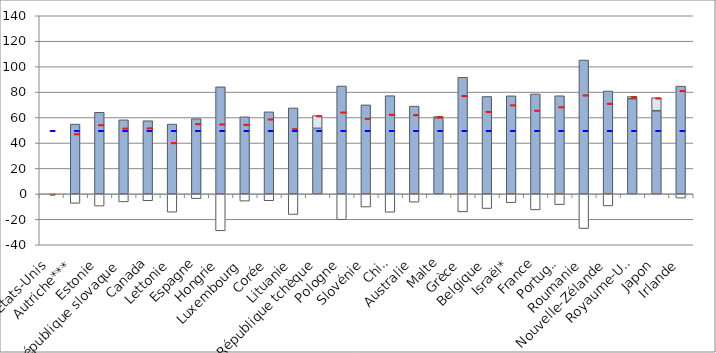
| Category | Revenus brut | Impôts nets | Transferts nets |
|---|---|---|---|
| Etats-Unis | 0 | 0 | 0 |
| Autriche*** | 54.855 | -7.434 | 0 |
| Estonie | 64.139 | -9.627 | 0 |
| République slovaque | 58.189 | -6.344 | 0 |
| Canada | 57.499 | -5.45 | 0 |
| Lettonie | 54.864 | -14.422 | 0 |
| Espagne | 59.098 | -3.785 | 0 |
| Hongrie | 84.153 | -29.033 | 0 |
| Luxembourg | 60.564 | -5.705 | 0 |
| Corée | 64.483 | -5.412 | 0 |
| Lituanie | 67.56 | -16.214 | 0 |
| République tchèque | 51.51 | 0 | 10.015 |
| Pologne | 84.79 | -20.305 | 0 |
| Slovénie | 69.955 | -10.355 | 0 |
| Chili | 77.196 | -14.482 | 0 |
| Australie | 68.954 | -6.547 | 0 |
| Malte | 59.619 | 0 | 1.172 |
| Grèce | 91.617 | -14.201 | 0 |
| Belgique | 76.572 | -11.555 | 0 |
| Israël* | 77.066 | -6.936 | 0 |
| France | 78.565 | -12.625 | 0 |
| Portugal | 77.123 | -8.483 | 0 |
| Roumanie | 105.203 | -27.268 | 0 |
| Nouvelle-Zélande | 80.865 | -9.499 | 0 |
| Royaume-Uni | 74.791 | 0 | 1.728 |
| Japon | 65.36 | 0 | 10.19 |
| Irlande | 84.705 | -3.35 | 0 |